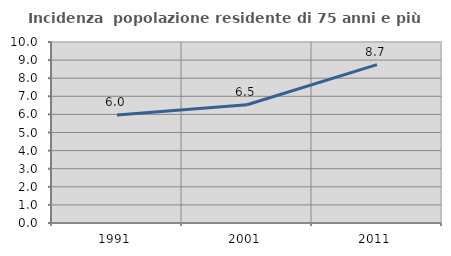
| Category | Incidenza  popolazione residente di 75 anni e più |
|---|---|
| 1991.0 | 5.973 |
| 2001.0 | 6.533 |
| 2011.0 | 8.749 |